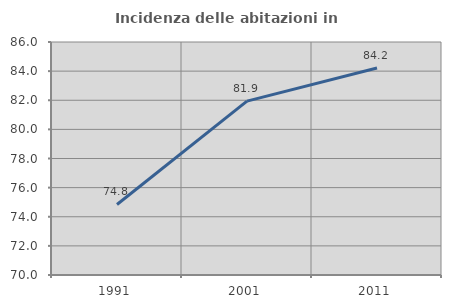
| Category | Incidenza delle abitazioni in proprietà  |
|---|---|
| 1991.0 | 74.844 |
| 2001.0 | 81.942 |
| 2011.0 | 84.211 |